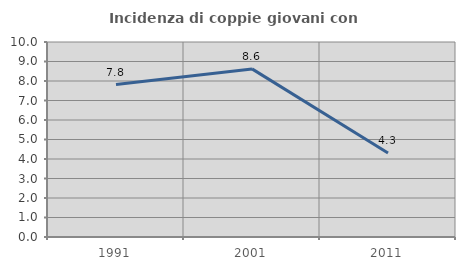
| Category | Incidenza di coppie giovani con figli |
|---|---|
| 1991.0 | 7.819 |
| 2001.0 | 8.621 |
| 2011.0 | 4.31 |